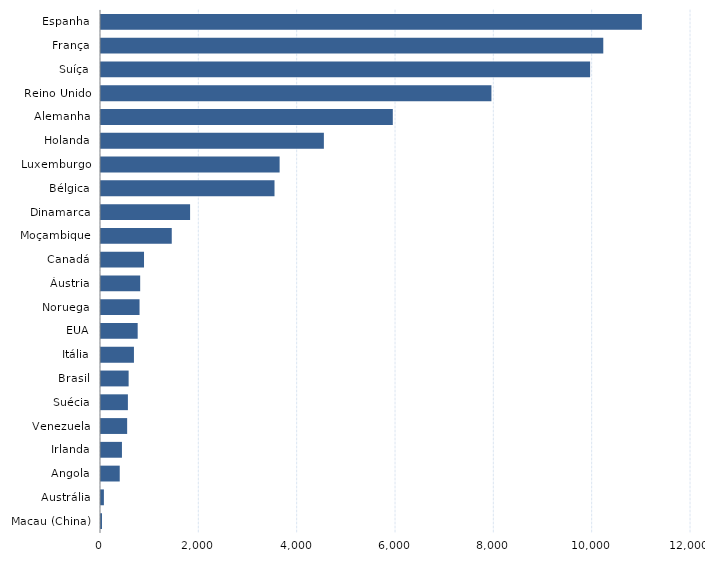
| Category | Series 0 |
|---|---|
| Macau (China) | 20 |
| Austrália | 59 |
| Angola | 381 |
| Irlanda | 426 |
| Venezuela | 532 |
| Suécia | 547 |
| Brasil | 562 |
| Itália | 670 |
| EUA | 746 |
| Noruega | 784 |
| Áustria | 797 |
| Canadá | 875 |
| Moçambique | 1439 |
| Dinamarca | 1812 |
| Bélgica | 3529 |
| Luxemburgo | 3633 |
| Holanda | 4533 |
| Alemanha | 5935 |
| Reino Unido | 7941 |
| Suíça | 9948 |
| França | 10216 |
| Espanha | 11001 |